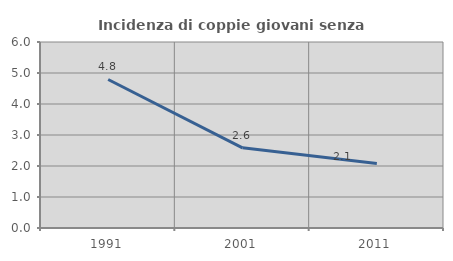
| Category | Incidenza di coppie giovani senza figli |
|---|---|
| 1991.0 | 4.79 |
| 2001.0 | 2.586 |
| 2011.0 | 2.083 |